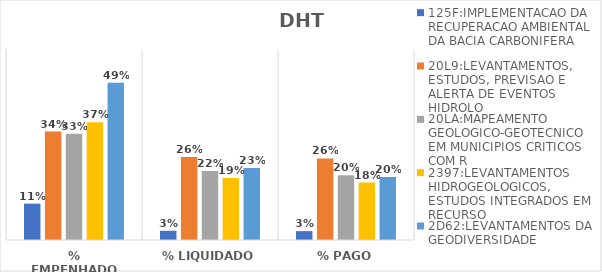
| Category | 125F:IMPLEMENTACAO DA RECUPERACAO AMBIENTAL DA BACIA CARBONIFERA | 20L9:LEVANTAMENTOS, ESTUDOS, PREVISAO E ALERTA DE EVENTOS HIDROLO | 20LA:MAPEAMENTO GEOLOGICO-GEOTECNICO EM MUNICIPIOS CRITICOS COM R | 2397:LEVANTAMENTOS HIDROGEOLOGICOS, ESTUDOS INTEGRADOS EM RECURSO | 2D62:LEVANTAMENTOS DA GEODIVERSIDADE |
|---|---|---|---|---|---|
| % EMPENHADO | 0.114 | 0.341 | 0.334 | 0.37 | 0.494 |
| % LIQUIDADO | 0.029 | 0.261 | 0.217 | 0.195 | 0.226 |
| % PAGO | 0.028 | 0.256 | 0.204 | 0.18 | 0.198 |